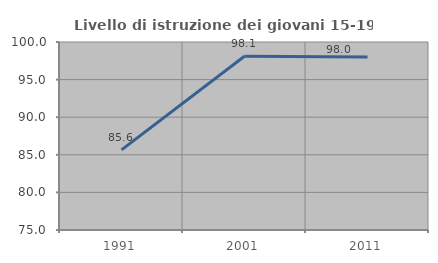
| Category | Livello di istruzione dei giovani 15-19 anni |
|---|---|
| 1991.0 | 85.648 |
| 2001.0 | 98.113 |
| 2011.0 | 98.013 |